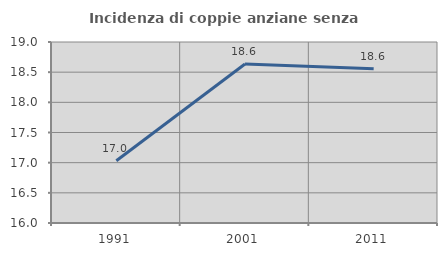
| Category | Incidenza di coppie anziane senza figli  |
|---|---|
| 1991.0 | 17.031 |
| 2001.0 | 18.636 |
| 2011.0 | 18.557 |